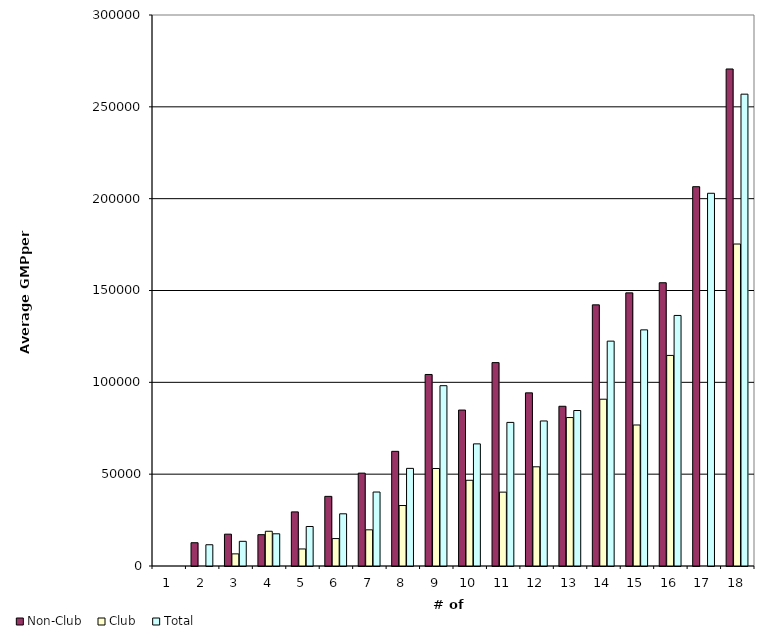
| Category | Non-Club | Club | Total |
|---|---|---|---|
| 1.0 | 0 | 0 | 0 |
| 2.0 | 12673.259 | 0 | 11573.433 |
| 3.0 | 17336.978 | 6607.475 | 13435.34 |
| 4.0 | 17061.065 | 18914.439 | 17537.647 |
| 5.0 | 29453.439 | 9280.291 | 21506.441 |
| 6.0 | 37912.593 | 14934.5 | 28421.642 |
| 7.0 | 50561.279 | 19700.278 | 40274.279 |
| 8.0 | 62428.48 | 32928.546 | 53157.073 |
| 9.0 | 104278.975 | 53088.112 | 98173.643 |
| 10.0 | 84904.814 | 46675.794 | 66498.249 |
| 11.0 | 110732.346 | 40215.84 | 78186.266 |
| 12.0 | 94263.052 | 54006.885 | 78965.709 |
| 13.0 | 86967.332 | 80819.193 | 84661.78 |
| 14.0 | 142187.66 | 90813.015 | 122428.181 |
| 15.0 | 148711.516 | 76776.12 | 128569.605 |
| 16.0 | 154225.172 | 114655.759 | 136418.936 |
| 17.0 | 206523.628 | 0 | 202936.735 |
| 18.0 | 270607.627 | 175303.172 | 256899.452 |